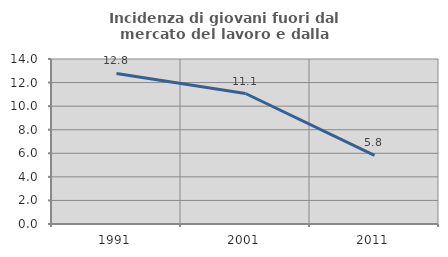
| Category | Incidenza di giovani fuori dal mercato del lavoro e dalla formazione  |
|---|---|
| 1991.0 | 12.774 |
| 2001.0 | 11.071 |
| 2011.0 | 5.83 |